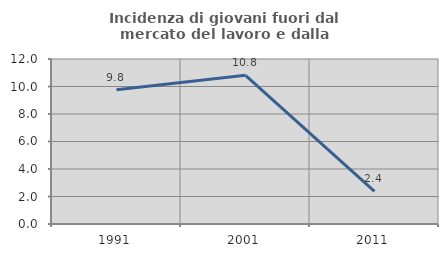
| Category | Incidenza di giovani fuori dal mercato del lavoro e dalla formazione  |
|---|---|
| 1991.0 | 9.756 |
| 2001.0 | 10.811 |
| 2011.0 | 2.381 |